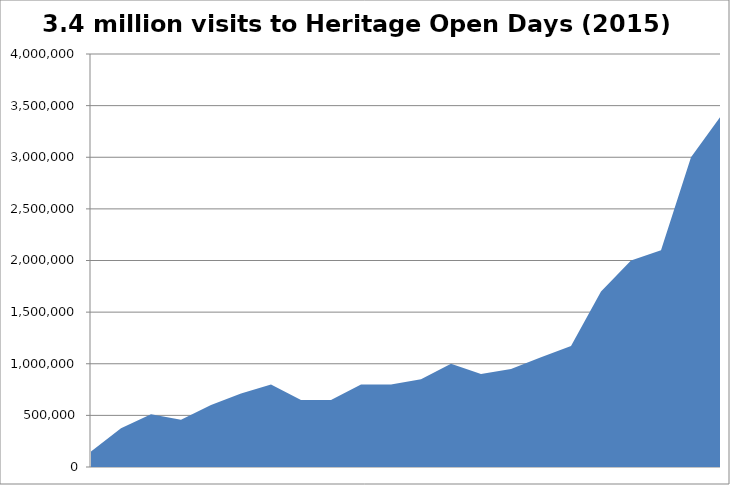
| Category | Number of HOD Visits |
|---|---|
| 0 | 150000 |
| 1 | 375000 |
| 2 | 512000 |
| 3 | 457000 |
| 4 | 600000 |
| 5 | 712000 |
| 6 | 800000 |
| 7 | 650000 |
| 8 | 650000 |
| 9 | 800000 |
| 10 | 800000 |
| 11 | 850000 |
| 12 | 1000000 |
| 13 | 900000 |
| 14 | 950000 |
| 15 | 1062000 |
| 16 | 1172000 |
| 17 | 1700000 |
| 18 | 2000000 |
| 19 | 2100000 |
| 20 | 3000000 |
| 21 | 3400000 |